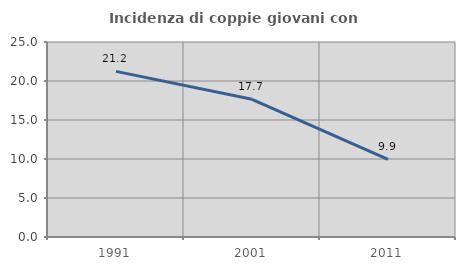
| Category | Incidenza di coppie giovani con figli |
|---|---|
| 1991.0 | 21.231 |
| 2001.0 | 17.656 |
| 2011.0 | 9.937 |